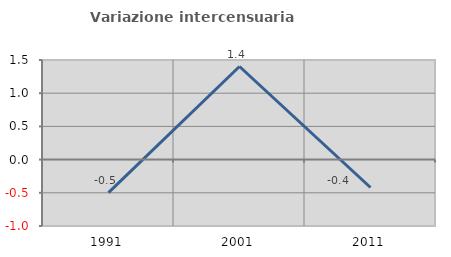
| Category | Variazione intercensuaria annua |
|---|---|
| 1991.0 | -0.496 |
| 2001.0 | 1.402 |
| 2011.0 | -0.42 |